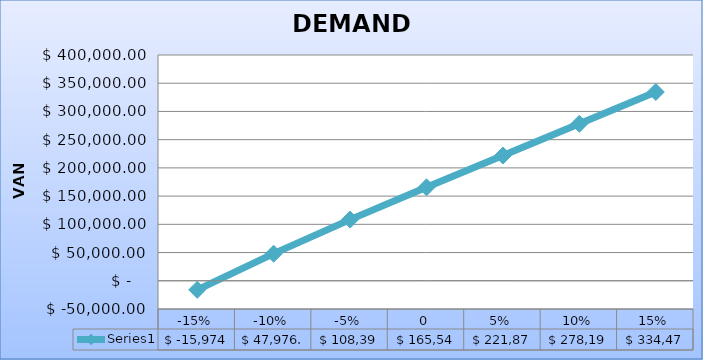
| Category | Series 0 |
|---|---|
| -0.15 | -15974.394 |
| -0.1 | 47976.451 |
| -0.05 | 108396.561 |
| 0.0 | 165544.897 |
| 0.05 | 221870.742 |
| 0.1 | 278196.588 |
| 0.15 | 334472.307 |